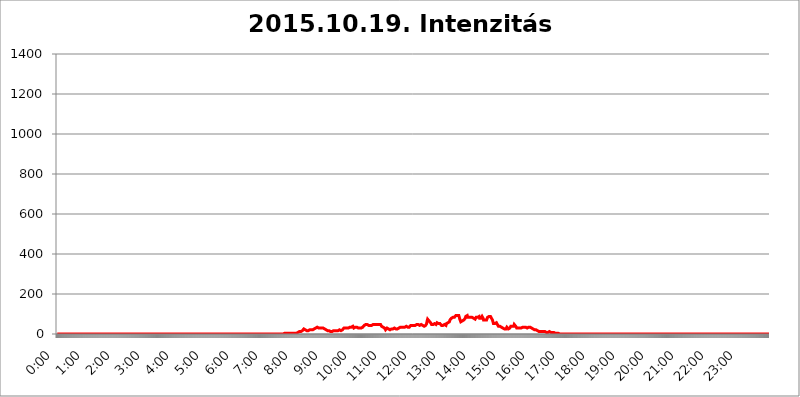
| Category | 2015.10.19. Intenzitás [W/m^2] |
|---|---|
| 0.0 | 0 |
| 0.0006944444444444445 | 0 |
| 0.001388888888888889 | 0 |
| 0.0020833333333333333 | 0 |
| 0.002777777777777778 | 0 |
| 0.003472222222222222 | 0 |
| 0.004166666666666667 | 0 |
| 0.004861111111111111 | 0 |
| 0.005555555555555556 | 0 |
| 0.0062499999999999995 | 0 |
| 0.006944444444444444 | 0 |
| 0.007638888888888889 | 0 |
| 0.008333333333333333 | 0 |
| 0.009027777777777779 | 0 |
| 0.009722222222222222 | 0 |
| 0.010416666666666666 | 0 |
| 0.011111111111111112 | 0 |
| 0.011805555555555555 | 0 |
| 0.012499999999999999 | 0 |
| 0.013194444444444444 | 0 |
| 0.013888888888888888 | 0 |
| 0.014583333333333332 | 0 |
| 0.015277777777777777 | 0 |
| 0.015972222222222224 | 0 |
| 0.016666666666666666 | 0 |
| 0.017361111111111112 | 0 |
| 0.018055555555555557 | 0 |
| 0.01875 | 0 |
| 0.019444444444444445 | 0 |
| 0.02013888888888889 | 0 |
| 0.020833333333333332 | 0 |
| 0.02152777777777778 | 0 |
| 0.022222222222222223 | 0 |
| 0.02291666666666667 | 0 |
| 0.02361111111111111 | 0 |
| 0.024305555555555556 | 0 |
| 0.024999999999999998 | 0 |
| 0.025694444444444447 | 0 |
| 0.02638888888888889 | 0 |
| 0.027083333333333334 | 0 |
| 0.027777777777777776 | 0 |
| 0.02847222222222222 | 0 |
| 0.029166666666666664 | 0 |
| 0.029861111111111113 | 0 |
| 0.030555555555555555 | 0 |
| 0.03125 | 0 |
| 0.03194444444444445 | 0 |
| 0.03263888888888889 | 0 |
| 0.03333333333333333 | 0 |
| 0.034027777777777775 | 0 |
| 0.034722222222222224 | 0 |
| 0.035416666666666666 | 0 |
| 0.036111111111111115 | 0 |
| 0.03680555555555556 | 0 |
| 0.0375 | 0 |
| 0.03819444444444444 | 0 |
| 0.03888888888888889 | 0 |
| 0.03958333333333333 | 0 |
| 0.04027777777777778 | 0 |
| 0.04097222222222222 | 0 |
| 0.041666666666666664 | 0 |
| 0.042361111111111106 | 0 |
| 0.04305555555555556 | 0 |
| 0.043750000000000004 | 0 |
| 0.044444444444444446 | 0 |
| 0.04513888888888889 | 0 |
| 0.04583333333333334 | 0 |
| 0.04652777777777778 | 0 |
| 0.04722222222222222 | 0 |
| 0.04791666666666666 | 0 |
| 0.04861111111111111 | 0 |
| 0.049305555555555554 | 0 |
| 0.049999999999999996 | 0 |
| 0.05069444444444445 | 0 |
| 0.051388888888888894 | 0 |
| 0.052083333333333336 | 0 |
| 0.05277777777777778 | 0 |
| 0.05347222222222222 | 0 |
| 0.05416666666666667 | 0 |
| 0.05486111111111111 | 0 |
| 0.05555555555555555 | 0 |
| 0.05625 | 0 |
| 0.05694444444444444 | 0 |
| 0.057638888888888885 | 0 |
| 0.05833333333333333 | 0 |
| 0.05902777777777778 | 0 |
| 0.059722222222222225 | 0 |
| 0.06041666666666667 | 0 |
| 0.061111111111111116 | 0 |
| 0.06180555555555556 | 0 |
| 0.0625 | 0 |
| 0.06319444444444444 | 0 |
| 0.06388888888888888 | 0 |
| 0.06458333333333334 | 0 |
| 0.06527777777777778 | 0 |
| 0.06597222222222222 | 0 |
| 0.06666666666666667 | 0 |
| 0.06736111111111111 | 0 |
| 0.06805555555555555 | 0 |
| 0.06874999999999999 | 0 |
| 0.06944444444444443 | 0 |
| 0.07013888888888889 | 0 |
| 0.07083333333333333 | 0 |
| 0.07152777777777779 | 0 |
| 0.07222222222222223 | 0 |
| 0.07291666666666667 | 0 |
| 0.07361111111111111 | 0 |
| 0.07430555555555556 | 0 |
| 0.075 | 0 |
| 0.07569444444444444 | 0 |
| 0.0763888888888889 | 0 |
| 0.07708333333333334 | 0 |
| 0.07777777777777778 | 0 |
| 0.07847222222222222 | 0 |
| 0.07916666666666666 | 0 |
| 0.0798611111111111 | 0 |
| 0.08055555555555556 | 0 |
| 0.08125 | 0 |
| 0.08194444444444444 | 0 |
| 0.08263888888888889 | 0 |
| 0.08333333333333333 | 0 |
| 0.08402777777777777 | 0 |
| 0.08472222222222221 | 0 |
| 0.08541666666666665 | 0 |
| 0.08611111111111112 | 0 |
| 0.08680555555555557 | 0 |
| 0.08750000000000001 | 0 |
| 0.08819444444444445 | 0 |
| 0.08888888888888889 | 0 |
| 0.08958333333333333 | 0 |
| 0.09027777777777778 | 0 |
| 0.09097222222222222 | 0 |
| 0.09166666666666667 | 0 |
| 0.09236111111111112 | 0 |
| 0.09305555555555556 | 0 |
| 0.09375 | 0 |
| 0.09444444444444444 | 0 |
| 0.09513888888888888 | 0 |
| 0.09583333333333333 | 0 |
| 0.09652777777777777 | 0 |
| 0.09722222222222222 | 0 |
| 0.09791666666666667 | 0 |
| 0.09861111111111111 | 0 |
| 0.09930555555555555 | 0 |
| 0.09999999999999999 | 0 |
| 0.10069444444444443 | 0 |
| 0.1013888888888889 | 0 |
| 0.10208333333333335 | 0 |
| 0.10277777777777779 | 0 |
| 0.10347222222222223 | 0 |
| 0.10416666666666667 | 0 |
| 0.10486111111111111 | 0 |
| 0.10555555555555556 | 0 |
| 0.10625 | 0 |
| 0.10694444444444444 | 0 |
| 0.1076388888888889 | 0 |
| 0.10833333333333334 | 0 |
| 0.10902777777777778 | 0 |
| 0.10972222222222222 | 0 |
| 0.1111111111111111 | 0 |
| 0.11180555555555556 | 0 |
| 0.11180555555555556 | 0 |
| 0.1125 | 0 |
| 0.11319444444444444 | 0 |
| 0.11388888888888889 | 0 |
| 0.11458333333333333 | 0 |
| 0.11527777777777777 | 0 |
| 0.11597222222222221 | 0 |
| 0.11666666666666665 | 0 |
| 0.1173611111111111 | 0 |
| 0.11805555555555557 | 0 |
| 0.11944444444444445 | 0 |
| 0.12013888888888889 | 0 |
| 0.12083333333333333 | 0 |
| 0.12152777777777778 | 0 |
| 0.12222222222222223 | 0 |
| 0.12291666666666667 | 0 |
| 0.12291666666666667 | 0 |
| 0.12361111111111112 | 0 |
| 0.12430555555555556 | 0 |
| 0.125 | 0 |
| 0.12569444444444444 | 0 |
| 0.12638888888888888 | 0 |
| 0.12708333333333333 | 0 |
| 0.16875 | 0 |
| 0.12847222222222224 | 0 |
| 0.12916666666666668 | 0 |
| 0.12986111111111112 | 0 |
| 0.13055555555555556 | 0 |
| 0.13125 | 0 |
| 0.13194444444444445 | 0 |
| 0.1326388888888889 | 0 |
| 0.13333333333333333 | 0 |
| 0.13402777777777777 | 0 |
| 0.13402777777777777 | 0 |
| 0.13472222222222222 | 0 |
| 0.13541666666666666 | 0 |
| 0.1361111111111111 | 0 |
| 0.13749999999999998 | 0 |
| 0.13819444444444443 | 0 |
| 0.1388888888888889 | 0 |
| 0.13958333333333334 | 0 |
| 0.14027777777777778 | 0 |
| 0.14097222222222222 | 0 |
| 0.14166666666666666 | 0 |
| 0.1423611111111111 | 0 |
| 0.14305555555555557 | 0 |
| 0.14375000000000002 | 0 |
| 0.14444444444444446 | 0 |
| 0.1451388888888889 | 0 |
| 0.1451388888888889 | 0 |
| 0.14652777777777778 | 0 |
| 0.14722222222222223 | 0 |
| 0.14791666666666667 | 0 |
| 0.1486111111111111 | 0 |
| 0.14930555555555555 | 0 |
| 0.15 | 0 |
| 0.15069444444444444 | 0 |
| 0.15138888888888888 | 0 |
| 0.15208333333333332 | 0 |
| 0.15277777777777776 | 0 |
| 0.15347222222222223 | 0 |
| 0.15416666666666667 | 0 |
| 0.15486111111111112 | 0 |
| 0.15555555555555556 | 0 |
| 0.15625 | 0 |
| 0.15694444444444444 | 0 |
| 0.15763888888888888 | 0 |
| 0.15833333333333333 | 0 |
| 0.15902777777777777 | 0 |
| 0.15972222222222224 | 0 |
| 0.16041666666666668 | 0 |
| 0.16111111111111112 | 0 |
| 0.16180555555555556 | 0 |
| 0.1625 | 0 |
| 0.16319444444444445 | 0 |
| 0.1638888888888889 | 0 |
| 0.16458333333333333 | 0 |
| 0.16527777777777777 | 0 |
| 0.16597222222222222 | 0 |
| 0.16666666666666666 | 0 |
| 0.1673611111111111 | 0 |
| 0.16805555555555554 | 0 |
| 0.16874999999999998 | 0 |
| 0.16944444444444443 | 0 |
| 0.17013888888888887 | 0 |
| 0.1708333333333333 | 0 |
| 0.17152777777777775 | 0 |
| 0.17222222222222225 | 0 |
| 0.1729166666666667 | 0 |
| 0.17361111111111113 | 0 |
| 0.17430555555555557 | 0 |
| 0.17500000000000002 | 0 |
| 0.17569444444444446 | 0 |
| 0.1763888888888889 | 0 |
| 0.17708333333333334 | 0 |
| 0.17777777777777778 | 0 |
| 0.17847222222222223 | 0 |
| 0.17916666666666667 | 0 |
| 0.1798611111111111 | 0 |
| 0.18055555555555555 | 0 |
| 0.18125 | 0 |
| 0.18194444444444444 | 0 |
| 0.1826388888888889 | 0 |
| 0.18333333333333335 | 0 |
| 0.1840277777777778 | 0 |
| 0.18472222222222223 | 0 |
| 0.18541666666666667 | 0 |
| 0.18611111111111112 | 0 |
| 0.18680555555555556 | 0 |
| 0.1875 | 0 |
| 0.18819444444444444 | 0 |
| 0.18888888888888888 | 0 |
| 0.18958333333333333 | 0 |
| 0.19027777777777777 | 0 |
| 0.1909722222222222 | 0 |
| 0.19166666666666665 | 0 |
| 0.19236111111111112 | 0 |
| 0.19305555555555554 | 0 |
| 0.19375 | 0 |
| 0.19444444444444445 | 0 |
| 0.1951388888888889 | 0 |
| 0.19583333333333333 | 0 |
| 0.19652777777777777 | 0 |
| 0.19722222222222222 | 0 |
| 0.19791666666666666 | 0 |
| 0.1986111111111111 | 0 |
| 0.19930555555555554 | 0 |
| 0.19999999999999998 | 0 |
| 0.20069444444444443 | 0 |
| 0.20138888888888887 | 0 |
| 0.2020833333333333 | 0 |
| 0.2027777777777778 | 0 |
| 0.2034722222222222 | 0 |
| 0.2041666666666667 | 0 |
| 0.20486111111111113 | 0 |
| 0.20555555555555557 | 0 |
| 0.20625000000000002 | 0 |
| 0.20694444444444446 | 0 |
| 0.2076388888888889 | 0 |
| 0.20833333333333334 | 0 |
| 0.20902777777777778 | 0 |
| 0.20972222222222223 | 0 |
| 0.21041666666666667 | 0 |
| 0.2111111111111111 | 0 |
| 0.21180555555555555 | 0 |
| 0.2125 | 0 |
| 0.21319444444444444 | 0 |
| 0.2138888888888889 | 0 |
| 0.21458333333333335 | 0 |
| 0.2152777777777778 | 0 |
| 0.21597222222222223 | 0 |
| 0.21666666666666667 | 0 |
| 0.21736111111111112 | 0 |
| 0.21805555555555556 | 0 |
| 0.21875 | 0 |
| 0.21944444444444444 | 0 |
| 0.22013888888888888 | 0 |
| 0.22083333333333333 | 0 |
| 0.22152777777777777 | 0 |
| 0.2222222222222222 | 0 |
| 0.22291666666666665 | 0 |
| 0.2236111111111111 | 0 |
| 0.22430555555555556 | 0 |
| 0.225 | 0 |
| 0.22569444444444445 | 0 |
| 0.2263888888888889 | 0 |
| 0.22708333333333333 | 0 |
| 0.22777777777777777 | 0 |
| 0.22847222222222222 | 0 |
| 0.22916666666666666 | 0 |
| 0.2298611111111111 | 0 |
| 0.23055555555555554 | 0 |
| 0.23124999999999998 | 0 |
| 0.23194444444444443 | 0 |
| 0.23263888888888887 | 0 |
| 0.2333333333333333 | 0 |
| 0.2340277777777778 | 0 |
| 0.2347222222222222 | 0 |
| 0.2354166666666667 | 0 |
| 0.23611111111111113 | 0 |
| 0.23680555555555557 | 0 |
| 0.23750000000000002 | 0 |
| 0.23819444444444446 | 0 |
| 0.2388888888888889 | 0 |
| 0.23958333333333334 | 0 |
| 0.24027777777777778 | 0 |
| 0.24097222222222223 | 0 |
| 0.24166666666666667 | 0 |
| 0.2423611111111111 | 0 |
| 0.24305555555555555 | 0 |
| 0.24375 | 0 |
| 0.24444444444444446 | 0 |
| 0.24513888888888888 | 0 |
| 0.24583333333333335 | 0 |
| 0.2465277777777778 | 0 |
| 0.24722222222222223 | 0 |
| 0.24791666666666667 | 0 |
| 0.24861111111111112 | 0 |
| 0.24930555555555556 | 0 |
| 0.25 | 0 |
| 0.25069444444444444 | 0 |
| 0.2513888888888889 | 0 |
| 0.2520833333333333 | 0 |
| 0.25277777777777777 | 0 |
| 0.2534722222222222 | 0 |
| 0.25416666666666665 | 0 |
| 0.2548611111111111 | 0 |
| 0.2555555555555556 | 0 |
| 0.25625000000000003 | 0 |
| 0.2569444444444445 | 0 |
| 0.2576388888888889 | 0 |
| 0.25833333333333336 | 0 |
| 0.2590277777777778 | 0 |
| 0.25972222222222224 | 0 |
| 0.2604166666666667 | 0 |
| 0.2611111111111111 | 0 |
| 0.26180555555555557 | 0 |
| 0.2625 | 0 |
| 0.26319444444444445 | 0 |
| 0.2638888888888889 | 0 |
| 0.26458333333333334 | 0 |
| 0.2652777777777778 | 0 |
| 0.2659722222222222 | 0 |
| 0.26666666666666666 | 0 |
| 0.2673611111111111 | 0 |
| 0.26805555555555555 | 0 |
| 0.26875 | 0 |
| 0.26944444444444443 | 0 |
| 0.2701388888888889 | 0 |
| 0.2708333333333333 | 0 |
| 0.27152777777777776 | 0 |
| 0.2722222222222222 | 0 |
| 0.27291666666666664 | 0 |
| 0.2736111111111111 | 0 |
| 0.2743055555555555 | 0 |
| 0.27499999999999997 | 0 |
| 0.27569444444444446 | 0 |
| 0.27638888888888885 | 0 |
| 0.27708333333333335 | 0 |
| 0.2777777777777778 | 0 |
| 0.27847222222222223 | 0 |
| 0.2791666666666667 | 0 |
| 0.2798611111111111 | 0 |
| 0.28055555555555556 | 0 |
| 0.28125 | 0 |
| 0.28194444444444444 | 0 |
| 0.2826388888888889 | 0 |
| 0.2833333333333333 | 0 |
| 0.28402777777777777 | 0 |
| 0.2847222222222222 | 0 |
| 0.28541666666666665 | 0 |
| 0.28611111111111115 | 0 |
| 0.28680555555555554 | 0 |
| 0.28750000000000003 | 0 |
| 0.2881944444444445 | 0 |
| 0.2888888888888889 | 0 |
| 0.28958333333333336 | 0 |
| 0.2902777777777778 | 0 |
| 0.29097222222222224 | 0 |
| 0.2916666666666667 | 0 |
| 0.2923611111111111 | 0 |
| 0.29305555555555557 | 0 |
| 0.29375 | 0 |
| 0.29444444444444445 | 0 |
| 0.2951388888888889 | 0 |
| 0.29583333333333334 | 0 |
| 0.2965277777777778 | 0 |
| 0.2972222222222222 | 0 |
| 0.29791666666666666 | 0 |
| 0.2986111111111111 | 0 |
| 0.29930555555555555 | 0 |
| 0.3 | 0 |
| 0.30069444444444443 | 0 |
| 0.3013888888888889 | 0 |
| 0.3020833333333333 | 0 |
| 0.30277777777777776 | 0 |
| 0.3034722222222222 | 0 |
| 0.30416666666666664 | 0 |
| 0.3048611111111111 | 0 |
| 0.3055555555555555 | 0 |
| 0.30624999999999997 | 0 |
| 0.3069444444444444 | 0 |
| 0.3076388888888889 | 0 |
| 0.30833333333333335 | 0 |
| 0.3090277777777778 | 0 |
| 0.30972222222222223 | 0 |
| 0.3104166666666667 | 0 |
| 0.3111111111111111 | 0 |
| 0.31180555555555556 | 0 |
| 0.3125 | 0 |
| 0.31319444444444444 | 0 |
| 0.3138888888888889 | 0 |
| 0.3145833333333333 | 0 |
| 0.31527777777777777 | 0 |
| 0.3159722222222222 | 0 |
| 0.31666666666666665 | 0 |
| 0.31736111111111115 | 0 |
| 0.31805555555555554 | 3.525 |
| 0.31875000000000003 | 3.525 |
| 0.3194444444444445 | 3.525 |
| 0.3201388888888889 | 3.525 |
| 0.32083333333333336 | 3.525 |
| 0.3215277777777778 | 3.525 |
| 0.32222222222222224 | 3.525 |
| 0.3229166666666667 | 3.525 |
| 0.3236111111111111 | 3.525 |
| 0.32430555555555557 | 3.525 |
| 0.325 | 3.525 |
| 0.32569444444444445 | 3.525 |
| 0.3263888888888889 | 3.525 |
| 0.32708333333333334 | 3.525 |
| 0.3277777777777778 | 3.525 |
| 0.3284722222222222 | 3.525 |
| 0.32916666666666666 | 3.525 |
| 0.3298611111111111 | 3.525 |
| 0.33055555555555555 | 3.525 |
| 0.33125 | 3.525 |
| 0.33194444444444443 | 3.525 |
| 0.3326388888888889 | 3.525 |
| 0.3333333333333333 | 3.525 |
| 0.3340277777777778 | 3.525 |
| 0.3347222222222222 | 3.525 |
| 0.3354166666666667 | 3.525 |
| 0.3361111111111111 | 7.887 |
| 0.3368055555555556 | 7.887 |
| 0.33749999999999997 | 7.887 |
| 0.33819444444444446 | 7.887 |
| 0.33888888888888885 | 12.257 |
| 0.33958333333333335 | 12.257 |
| 0.34027777777777773 | 12.257 |
| 0.34097222222222223 | 7.887 |
| 0.3416666666666666 | 12.257 |
| 0.3423611111111111 | 12.257 |
| 0.3430555555555555 | 12.257 |
| 0.34375 | 16.636 |
| 0.3444444444444445 | 21.024 |
| 0.3451388888888889 | 21.024 |
| 0.3458333333333334 | 25.419 |
| 0.34652777777777777 | 25.419 |
| 0.34722222222222227 | 21.024 |
| 0.34791666666666665 | 21.024 |
| 0.34861111111111115 | 16.636 |
| 0.34930555555555554 | 16.636 |
| 0.35000000000000003 | 16.636 |
| 0.3506944444444444 | 16.636 |
| 0.3513888888888889 | 16.636 |
| 0.3520833333333333 | 16.636 |
| 0.3527777777777778 | 21.024 |
| 0.3534722222222222 | 21.024 |
| 0.3541666666666667 | 21.024 |
| 0.3548611111111111 | 25.419 |
| 0.35555555555555557 | 25.419 |
| 0.35625 | 21.024 |
| 0.35694444444444445 | 21.024 |
| 0.3576388888888889 | 21.024 |
| 0.35833333333333334 | 21.024 |
| 0.3590277777777778 | 25.419 |
| 0.3597222222222222 | 25.419 |
| 0.36041666666666666 | 25.419 |
| 0.3611111111111111 | 25.419 |
| 0.36180555555555555 | 29.823 |
| 0.3625 | 29.823 |
| 0.36319444444444443 | 29.823 |
| 0.3638888888888889 | 34.234 |
| 0.3645833333333333 | 34.234 |
| 0.3652777777777778 | 34.234 |
| 0.3659722222222222 | 29.823 |
| 0.3666666666666667 | 29.823 |
| 0.3673611111111111 | 29.823 |
| 0.3680555555555556 | 29.823 |
| 0.36874999999999997 | 29.823 |
| 0.36944444444444446 | 29.823 |
| 0.37013888888888885 | 29.823 |
| 0.37083333333333335 | 29.823 |
| 0.37152777777777773 | 34.234 |
| 0.37222222222222223 | 29.823 |
| 0.3729166666666666 | 29.823 |
| 0.3736111111111111 | 29.823 |
| 0.3743055555555555 | 29.823 |
| 0.375 | 25.419 |
| 0.3756944444444445 | 25.419 |
| 0.3763888888888889 | 25.419 |
| 0.3770833333333334 | 21.024 |
| 0.37777777777777777 | 21.024 |
| 0.37847222222222227 | 16.636 |
| 0.37916666666666665 | 16.636 |
| 0.37986111111111115 | 16.636 |
| 0.38055555555555554 | 16.636 |
| 0.38125000000000003 | 16.636 |
| 0.3819444444444444 | 16.636 |
| 0.3826388888888889 | 12.257 |
| 0.3833333333333333 | 12.257 |
| 0.3840277777777778 | 12.257 |
| 0.3847222222222222 | 12.257 |
| 0.3854166666666667 | 12.257 |
| 0.3861111111111111 | 12.257 |
| 0.38680555555555557 | 12.257 |
| 0.3875 | 16.636 |
| 0.38819444444444445 | 12.257 |
| 0.3888888888888889 | 16.636 |
| 0.38958333333333334 | 16.636 |
| 0.3902777777777778 | 16.636 |
| 0.3909722222222222 | 16.636 |
| 0.39166666666666666 | 16.636 |
| 0.3923611111111111 | 16.636 |
| 0.39305555555555555 | 16.636 |
| 0.39375 | 16.636 |
| 0.39444444444444443 | 16.636 |
| 0.3951388888888889 | 16.636 |
| 0.3958333333333333 | 21.024 |
| 0.3965277777777778 | 21.024 |
| 0.3972222222222222 | 16.636 |
| 0.3979166666666667 | 16.636 |
| 0.3986111111111111 | 21.024 |
| 0.3993055555555556 | 21.024 |
| 0.39999999999999997 | 21.024 |
| 0.40069444444444446 | 25.419 |
| 0.40138888888888885 | 25.419 |
| 0.40208333333333335 | 29.823 |
| 0.40277777777777773 | 29.823 |
| 0.40347222222222223 | 29.823 |
| 0.4041666666666666 | 29.823 |
| 0.4048611111111111 | 25.419 |
| 0.4055555555555555 | 25.419 |
| 0.40625 | 29.823 |
| 0.4069444444444445 | 29.823 |
| 0.4076388888888889 | 29.823 |
| 0.4083333333333334 | 29.823 |
| 0.40902777777777777 | 29.823 |
| 0.40972222222222227 | 34.234 |
| 0.41041666666666665 | 34.234 |
| 0.41111111111111115 | 38.653 |
| 0.41180555555555554 | 34.234 |
| 0.41250000000000003 | 34.234 |
| 0.4131944444444444 | 38.653 |
| 0.4138888888888889 | 38.653 |
| 0.4145833333333333 | 38.653 |
| 0.4152777777777778 | 34.234 |
| 0.4159722222222222 | 29.823 |
| 0.4166666666666667 | 29.823 |
| 0.4173611111111111 | 34.234 |
| 0.41805555555555557 | 34.234 |
| 0.41875 | 38.653 |
| 0.41944444444444445 | 38.653 |
| 0.4201388888888889 | 34.234 |
| 0.42083333333333334 | 34.234 |
| 0.4215277777777778 | 29.823 |
| 0.4222222222222222 | 29.823 |
| 0.42291666666666666 | 29.823 |
| 0.4236111111111111 | 29.823 |
| 0.42430555555555555 | 29.823 |
| 0.425 | 29.823 |
| 0.42569444444444443 | 29.823 |
| 0.4263888888888889 | 29.823 |
| 0.4270833333333333 | 29.823 |
| 0.4277777777777778 | 29.823 |
| 0.4284722222222222 | 34.234 |
| 0.4291666666666667 | 34.234 |
| 0.4298611111111111 | 38.653 |
| 0.4305555555555556 | 43.079 |
| 0.43124999999999997 | 43.079 |
| 0.43194444444444446 | 47.511 |
| 0.43263888888888885 | 47.511 |
| 0.43333333333333335 | 47.511 |
| 0.43402777777777773 | 47.511 |
| 0.43472222222222223 | 47.511 |
| 0.4354166666666666 | 47.511 |
| 0.4361111111111111 | 43.079 |
| 0.4368055555555555 | 43.079 |
| 0.4375 | 43.079 |
| 0.4381944444444445 | 43.079 |
| 0.4388888888888889 | 43.079 |
| 0.4395833333333334 | 43.079 |
| 0.44027777777777777 | 43.079 |
| 0.44097222222222227 | 43.079 |
| 0.44166666666666665 | 43.079 |
| 0.44236111111111115 | 47.511 |
| 0.44305555555555554 | 47.511 |
| 0.44375000000000003 | 47.511 |
| 0.4444444444444444 | 47.511 |
| 0.4451388888888889 | 47.511 |
| 0.4458333333333333 | 51.951 |
| 0.4465277777777778 | 47.511 |
| 0.4472222222222222 | 47.511 |
| 0.4479166666666667 | 43.079 |
| 0.4486111111111111 | 47.511 |
| 0.44930555555555557 | 47.511 |
| 0.45 | 51.951 |
| 0.45069444444444445 | 51.951 |
| 0.4513888888888889 | 47.511 |
| 0.45208333333333334 | 47.511 |
| 0.4527777777777778 | 47.511 |
| 0.4534722222222222 | 47.511 |
| 0.45416666666666666 | 43.079 |
| 0.4548611111111111 | 38.653 |
| 0.45555555555555555 | 34.234 |
| 0.45625 | 34.234 |
| 0.45694444444444443 | 34.234 |
| 0.4576388888888889 | 34.234 |
| 0.4583333333333333 | 29.823 |
| 0.4590277777777778 | 29.823 |
| 0.4597222222222222 | 25.419 |
| 0.4604166666666667 | 21.024 |
| 0.4611111111111111 | 21.024 |
| 0.4618055555555556 | 25.419 |
| 0.46249999999999997 | 29.823 |
| 0.46319444444444446 | 29.823 |
| 0.46388888888888885 | 25.419 |
| 0.46458333333333335 | 25.419 |
| 0.46527777777777773 | 25.419 |
| 0.46597222222222223 | 21.024 |
| 0.4666666666666666 | 21.024 |
| 0.4673611111111111 | 25.419 |
| 0.4680555555555555 | 25.419 |
| 0.46875 | 25.419 |
| 0.4694444444444445 | 21.024 |
| 0.4701388888888889 | 25.419 |
| 0.4708333333333334 | 25.419 |
| 0.47152777777777777 | 25.419 |
| 0.47222222222222227 | 25.419 |
| 0.47291666666666665 | 29.823 |
| 0.47361111111111115 | 25.419 |
| 0.47430555555555554 | 29.823 |
| 0.47500000000000003 | 25.419 |
| 0.4756944444444444 | 25.419 |
| 0.4763888888888889 | 25.419 |
| 0.4770833333333333 | 25.419 |
| 0.4777777777777778 | 29.823 |
| 0.4784722222222222 | 29.823 |
| 0.4791666666666667 | 29.823 |
| 0.4798611111111111 | 29.823 |
| 0.48055555555555557 | 29.823 |
| 0.48125 | 34.234 |
| 0.48194444444444445 | 34.234 |
| 0.4826388888888889 | 34.234 |
| 0.48333333333333334 | 34.234 |
| 0.4840277777777778 | 34.234 |
| 0.4847222222222222 | 38.653 |
| 0.48541666666666666 | 34.234 |
| 0.4861111111111111 | 34.234 |
| 0.48680555555555555 | 34.234 |
| 0.4875 | 34.234 |
| 0.48819444444444443 | 38.653 |
| 0.4888888888888889 | 38.653 |
| 0.4895833333333333 | 38.653 |
| 0.4902777777777778 | 38.653 |
| 0.4909722222222222 | 34.234 |
| 0.4916666666666667 | 34.234 |
| 0.4923611111111111 | 34.234 |
| 0.4930555555555556 | 34.234 |
| 0.49374999999999997 | 34.234 |
| 0.49444444444444446 | 38.653 |
| 0.49513888888888885 | 38.653 |
| 0.49583333333333335 | 43.079 |
| 0.49652777777777773 | 43.079 |
| 0.49722222222222223 | 43.079 |
| 0.4979166666666666 | 43.079 |
| 0.4986111111111111 | 43.079 |
| 0.4993055555555555 | 43.079 |
| 0.5 | 43.079 |
| 0.5006944444444444 | 43.079 |
| 0.5013888888888889 | 47.511 |
| 0.5020833333333333 | 43.079 |
| 0.5027777777777778 | 43.079 |
| 0.5034722222222222 | 43.079 |
| 0.5041666666666667 | 47.511 |
| 0.5048611111111111 | 47.511 |
| 0.5055555555555555 | 47.511 |
| 0.50625 | 47.511 |
| 0.5069444444444444 | 43.079 |
| 0.5076388888888889 | 47.511 |
| 0.5083333333333333 | 43.079 |
| 0.5090277777777777 | 43.079 |
| 0.5097222222222222 | 43.079 |
| 0.5104166666666666 | 47.511 |
| 0.5111111111111112 | 47.511 |
| 0.5118055555555555 | 47.511 |
| 0.5125000000000001 | 43.079 |
| 0.5131944444444444 | 38.653 |
| 0.513888888888889 | 38.653 |
| 0.5145833333333333 | 38.653 |
| 0.5152777777777778 | 43.079 |
| 0.5159722222222222 | 43.079 |
| 0.5166666666666667 | 43.079 |
| 0.517361111111111 | 43.079 |
| 0.5180555555555556 | 51.951 |
| 0.5187499999999999 | 65.31 |
| 0.5194444444444445 | 74.246 |
| 0.5201388888888888 | 69.775 |
| 0.5208333333333334 | 69.775 |
| 0.5215277777777778 | 65.31 |
| 0.5222222222222223 | 65.31 |
| 0.5229166666666667 | 65.31 |
| 0.5236111111111111 | 56.398 |
| 0.5243055555555556 | 51.951 |
| 0.525 | 47.511 |
| 0.5256944444444445 | 47.511 |
| 0.5263888888888889 | 43.079 |
| 0.5270833333333333 | 47.511 |
| 0.5277777777777778 | 47.511 |
| 0.5284722222222222 | 47.511 |
| 0.5291666666666667 | 51.951 |
| 0.5298611111111111 | 51.951 |
| 0.5305555555555556 | 51.951 |
| 0.53125 | 47.511 |
| 0.5319444444444444 | 51.951 |
| 0.5326388888888889 | 56.398 |
| 0.5333333333333333 | 51.951 |
| 0.5340277777777778 | 51.951 |
| 0.5347222222222222 | 51.951 |
| 0.5354166666666667 | 51.951 |
| 0.5361111111111111 | 51.951 |
| 0.5368055555555555 | 51.951 |
| 0.5375 | 47.511 |
| 0.5381944444444444 | 47.511 |
| 0.5388888888888889 | 43.079 |
| 0.5395833333333333 | 43.079 |
| 0.5402777777777777 | 38.653 |
| 0.5409722222222222 | 43.079 |
| 0.5416666666666666 | 47.511 |
| 0.5423611111111112 | 47.511 |
| 0.5430555555555555 | 47.511 |
| 0.5437500000000001 | 47.511 |
| 0.5444444444444444 | 43.079 |
| 0.545138888888889 | 43.079 |
| 0.5458333333333333 | 51.951 |
| 0.5465277777777778 | 51.951 |
| 0.5472222222222222 | 56.398 |
| 0.5479166666666667 | 56.398 |
| 0.548611111111111 | 56.398 |
| 0.5493055555555556 | 56.398 |
| 0.5499999999999999 | 60.85 |
| 0.5506944444444445 | 69.775 |
| 0.5513888888888888 | 69.775 |
| 0.5520833333333334 | 74.246 |
| 0.5527777777777778 | 78.722 |
| 0.5534722222222223 | 78.722 |
| 0.5541666666666667 | 83.205 |
| 0.5548611111111111 | 83.205 |
| 0.5555555555555556 | 83.205 |
| 0.55625 | 83.205 |
| 0.5569444444444445 | 83.205 |
| 0.5576388888888889 | 83.205 |
| 0.5583333333333333 | 87.692 |
| 0.5590277777777778 | 92.184 |
| 0.5597222222222222 | 96.682 |
| 0.5604166666666667 | 92.184 |
| 0.5611111111111111 | 92.184 |
| 0.5618055555555556 | 92.184 |
| 0.5625 | 92.184 |
| 0.5631944444444444 | 92.184 |
| 0.5638888888888889 | 87.692 |
| 0.5645833333333333 | 74.246 |
| 0.5652777777777778 | 69.775 |
| 0.5659722222222222 | 60.85 |
| 0.5666666666666667 | 60.85 |
| 0.5673611111111111 | 65.31 |
| 0.5680555555555555 | 65.31 |
| 0.56875 | 65.31 |
| 0.5694444444444444 | 69.775 |
| 0.5701388888888889 | 69.775 |
| 0.5708333333333333 | 69.775 |
| 0.5715277777777777 | 69.775 |
| 0.5722222222222222 | 78.722 |
| 0.5729166666666666 | 87.692 |
| 0.5736111111111112 | 87.692 |
| 0.5743055555555555 | 92.184 |
| 0.5750000000000001 | 92.184 |
| 0.5756944444444444 | 83.205 |
| 0.576388888888889 | 78.722 |
| 0.5770833333333333 | 83.205 |
| 0.5777777777777778 | 83.205 |
| 0.5784722222222222 | 83.205 |
| 0.5791666666666667 | 87.692 |
| 0.579861111111111 | 83.205 |
| 0.5805555555555556 | 83.205 |
| 0.5812499999999999 | 83.205 |
| 0.5819444444444445 | 83.205 |
| 0.5826388888888888 | 83.205 |
| 0.5833333333333334 | 83.205 |
| 0.5840277777777778 | 78.722 |
| 0.5847222222222223 | 74.246 |
| 0.5854166666666667 | 74.246 |
| 0.5861111111111111 | 74.246 |
| 0.5868055555555556 | 74.246 |
| 0.5875 | 83.205 |
| 0.5881944444444445 | 78.722 |
| 0.5888888888888889 | 78.722 |
| 0.5895833333333333 | 83.205 |
| 0.5902777777777778 | 87.692 |
| 0.5909722222222222 | 87.692 |
| 0.5916666666666667 | 87.692 |
| 0.5923611111111111 | 78.722 |
| 0.5930555555555556 | 74.246 |
| 0.59375 | 74.246 |
| 0.5944444444444444 | 78.722 |
| 0.5951388888888889 | 83.205 |
| 0.5958333333333333 | 87.692 |
| 0.5965277777777778 | 87.692 |
| 0.5972222222222222 | 78.722 |
| 0.5979166666666667 | 69.775 |
| 0.5986111111111111 | 65.31 |
| 0.5993055555555555 | 65.31 |
| 0.6 | 69.775 |
| 0.6006944444444444 | 69.775 |
| 0.6013888888888889 | 69.775 |
| 0.6020833333333333 | 69.775 |
| 0.6027777777777777 | 74.246 |
| 0.6034722222222222 | 83.205 |
| 0.6041666666666666 | 83.205 |
| 0.6048611111111112 | 83.205 |
| 0.6055555555555555 | 87.692 |
| 0.6062500000000001 | 92.184 |
| 0.6069444444444444 | 87.692 |
| 0.607638888888889 | 87.692 |
| 0.6083333333333333 | 83.205 |
| 0.6090277777777778 | 78.722 |
| 0.6097222222222222 | 74.246 |
| 0.6104166666666667 | 69.775 |
| 0.611111111111111 | 60.85 |
| 0.6118055555555556 | 51.951 |
| 0.6124999999999999 | 47.511 |
| 0.6131944444444445 | 47.511 |
| 0.6138888888888888 | 51.951 |
| 0.6145833333333334 | 51.951 |
| 0.6152777777777778 | 51.951 |
| 0.6159722222222223 | 56.398 |
| 0.6166666666666667 | 51.951 |
| 0.6173611111111111 | 47.511 |
| 0.6180555555555556 | 47.511 |
| 0.61875 | 38.653 |
| 0.6194444444444445 | 34.234 |
| 0.6201388888888889 | 34.234 |
| 0.6208333333333333 | 38.653 |
| 0.6215277777777778 | 43.079 |
| 0.6222222222222222 | 38.653 |
| 0.6229166666666667 | 34.234 |
| 0.6236111111111111 | 34.234 |
| 0.6243055555555556 | 29.823 |
| 0.625 | 29.823 |
| 0.6256944444444444 | 34.234 |
| 0.6263888888888889 | 29.823 |
| 0.6270833333333333 | 25.419 |
| 0.6277777777777778 | 21.024 |
| 0.6284722222222222 | 21.024 |
| 0.6291666666666667 | 25.419 |
| 0.6298611111111111 | 29.823 |
| 0.6305555555555555 | 34.234 |
| 0.63125 | 34.234 |
| 0.6319444444444444 | 29.823 |
| 0.6326388888888889 | 25.419 |
| 0.6333333333333333 | 25.419 |
| 0.6340277777777777 | 25.419 |
| 0.6347222222222222 | 29.823 |
| 0.6354166666666666 | 29.823 |
| 0.6361111111111112 | 38.653 |
| 0.6368055555555555 | 38.653 |
| 0.6375000000000001 | 38.653 |
| 0.6381944444444444 | 38.653 |
| 0.638888888888889 | 38.653 |
| 0.6395833333333333 | 38.653 |
| 0.6402777777777778 | 38.653 |
| 0.6409722222222222 | 47.511 |
| 0.6416666666666667 | 47.511 |
| 0.642361111111111 | 47.511 |
| 0.6430555555555556 | 38.653 |
| 0.6437499999999999 | 34.234 |
| 0.6444444444444445 | 29.823 |
| 0.6451388888888888 | 29.823 |
| 0.6458333333333334 | 29.823 |
| 0.6465277777777778 | 29.823 |
| 0.6472222222222223 | 29.823 |
| 0.6479166666666667 | 29.823 |
| 0.6486111111111111 | 29.823 |
| 0.6493055555555556 | 29.823 |
| 0.65 | 29.823 |
| 0.6506944444444445 | 29.823 |
| 0.6513888888888889 | 29.823 |
| 0.6520833333333333 | 34.234 |
| 0.6527777777777778 | 34.234 |
| 0.6534722222222222 | 34.234 |
| 0.6541666666666667 | 34.234 |
| 0.6548611111111111 | 34.234 |
| 0.6555555555555556 | 34.234 |
| 0.65625 | 34.234 |
| 0.6569444444444444 | 34.234 |
| 0.6576388888888889 | 34.234 |
| 0.6583333333333333 | 34.234 |
| 0.6590277777777778 | 29.823 |
| 0.6597222222222222 | 29.823 |
| 0.6604166666666667 | 29.823 |
| 0.6611111111111111 | 34.234 |
| 0.6618055555555555 | 34.234 |
| 0.6625 | 34.234 |
| 0.6631944444444444 | 34.234 |
| 0.6638888888888889 | 34.234 |
| 0.6645833333333333 | 29.823 |
| 0.6652777777777777 | 29.823 |
| 0.6659722222222222 | 25.419 |
| 0.6666666666666666 | 25.419 |
| 0.6673611111111111 | 25.419 |
| 0.6680555555555556 | 21.024 |
| 0.6687500000000001 | 21.024 |
| 0.6694444444444444 | 21.024 |
| 0.6701388888888888 | 21.024 |
| 0.6708333333333334 | 21.024 |
| 0.6715277777777778 | 21.024 |
| 0.6722222222222222 | 21.024 |
| 0.6729166666666666 | 16.636 |
| 0.6736111111111112 | 16.636 |
| 0.6743055555555556 | 16.636 |
| 0.6749999999999999 | 16.636 |
| 0.6756944444444444 | 12.257 |
| 0.6763888888888889 | 12.257 |
| 0.6770833333333334 | 12.257 |
| 0.6777777777777777 | 12.257 |
| 0.6784722222222223 | 12.257 |
| 0.6791666666666667 | 12.257 |
| 0.6798611111111111 | 12.257 |
| 0.6805555555555555 | 12.257 |
| 0.68125 | 12.257 |
| 0.6819444444444445 | 12.257 |
| 0.6826388888888889 | 12.257 |
| 0.6833333333333332 | 12.257 |
| 0.6840277777777778 | 12.257 |
| 0.6847222222222222 | 12.257 |
| 0.6854166666666667 | 7.887 |
| 0.686111111111111 | 7.887 |
| 0.6868055555555556 | 7.887 |
| 0.6875 | 7.887 |
| 0.6881944444444444 | 7.887 |
| 0.688888888888889 | 12.257 |
| 0.6895833333333333 | 12.257 |
| 0.6902777777777778 | 12.257 |
| 0.6909722222222222 | 7.887 |
| 0.6916666666666668 | 12.257 |
| 0.6923611111111111 | 7.887 |
| 0.6930555555555555 | 7.887 |
| 0.69375 | 7.887 |
| 0.6944444444444445 | 7.887 |
| 0.6951388888888889 | 7.887 |
| 0.6958333333333333 | 7.887 |
| 0.6965277777777777 | 7.887 |
| 0.6972222222222223 | 3.525 |
| 0.6979166666666666 | 3.525 |
| 0.6986111111111111 | 3.525 |
| 0.6993055555555556 | 3.525 |
| 0.7000000000000001 | 3.525 |
| 0.7006944444444444 | 3.525 |
| 0.7013888888888888 | 3.525 |
| 0.7020833333333334 | 3.525 |
| 0.7027777777777778 | 3.525 |
| 0.7034722222222222 | 3.525 |
| 0.7041666666666666 | 3.525 |
| 0.7048611111111112 | 0 |
| 0.7055555555555556 | 3.525 |
| 0.7062499999999999 | 3.525 |
| 0.7069444444444444 | 0 |
| 0.7076388888888889 | 0 |
| 0.7083333333333334 | 0 |
| 0.7090277777777777 | 0 |
| 0.7097222222222223 | 0 |
| 0.7104166666666667 | 0 |
| 0.7111111111111111 | 0 |
| 0.7118055555555555 | 3.525 |
| 0.7125 | 0 |
| 0.7131944444444445 | 0 |
| 0.7138888888888889 | 0 |
| 0.7145833333333332 | 0 |
| 0.7152777777777778 | 0 |
| 0.7159722222222222 | 0 |
| 0.7166666666666667 | 0 |
| 0.717361111111111 | 0 |
| 0.7180555555555556 | 0 |
| 0.71875 | 0 |
| 0.7194444444444444 | 0 |
| 0.720138888888889 | 0 |
| 0.7208333333333333 | 0 |
| 0.7215277777777778 | 0 |
| 0.7222222222222222 | 0 |
| 0.7229166666666668 | 0 |
| 0.7236111111111111 | 0 |
| 0.7243055555555555 | 0 |
| 0.725 | 0 |
| 0.7256944444444445 | 0 |
| 0.7263888888888889 | 0 |
| 0.7270833333333333 | 0 |
| 0.7277777777777777 | 0 |
| 0.7284722222222223 | 0 |
| 0.7291666666666666 | 0 |
| 0.7298611111111111 | 0 |
| 0.7305555555555556 | 0 |
| 0.7312500000000001 | 0 |
| 0.7319444444444444 | 0 |
| 0.7326388888888888 | 0 |
| 0.7333333333333334 | 0 |
| 0.7340277777777778 | 0 |
| 0.7347222222222222 | 0 |
| 0.7354166666666666 | 0 |
| 0.7361111111111112 | 0 |
| 0.7368055555555556 | 0 |
| 0.7374999999999999 | 0 |
| 0.7381944444444444 | 0 |
| 0.7388888888888889 | 0 |
| 0.7395833333333334 | 0 |
| 0.7402777777777777 | 0 |
| 0.7409722222222223 | 0 |
| 0.7416666666666667 | 0 |
| 0.7423611111111111 | 0 |
| 0.7430555555555555 | 0 |
| 0.74375 | 0 |
| 0.7444444444444445 | 0 |
| 0.7451388888888889 | 0 |
| 0.7458333333333332 | 0 |
| 0.7465277777777778 | 0 |
| 0.7472222222222222 | 0 |
| 0.7479166666666667 | 0 |
| 0.748611111111111 | 0 |
| 0.7493055555555556 | 0 |
| 0.75 | 0 |
| 0.7506944444444444 | 0 |
| 0.751388888888889 | 0 |
| 0.7520833333333333 | 0 |
| 0.7527777777777778 | 0 |
| 0.7534722222222222 | 0 |
| 0.7541666666666668 | 0 |
| 0.7548611111111111 | 0 |
| 0.7555555555555555 | 0 |
| 0.75625 | 0 |
| 0.7569444444444445 | 0 |
| 0.7576388888888889 | 0 |
| 0.7583333333333333 | 0 |
| 0.7590277777777777 | 0 |
| 0.7597222222222223 | 0 |
| 0.7604166666666666 | 0 |
| 0.7611111111111111 | 0 |
| 0.7618055555555556 | 0 |
| 0.7625000000000001 | 0 |
| 0.7631944444444444 | 0 |
| 0.7638888888888888 | 0 |
| 0.7645833333333334 | 0 |
| 0.7652777777777778 | 0 |
| 0.7659722222222222 | 0 |
| 0.7666666666666666 | 0 |
| 0.7673611111111112 | 0 |
| 0.7680555555555556 | 0 |
| 0.7687499999999999 | 0 |
| 0.7694444444444444 | 0 |
| 0.7701388888888889 | 0 |
| 0.7708333333333334 | 0 |
| 0.7715277777777777 | 0 |
| 0.7722222222222223 | 0 |
| 0.7729166666666667 | 0 |
| 0.7736111111111111 | 0 |
| 0.7743055555555555 | 0 |
| 0.775 | 0 |
| 0.7756944444444445 | 0 |
| 0.7763888888888889 | 0 |
| 0.7770833333333332 | 0 |
| 0.7777777777777778 | 0 |
| 0.7784722222222222 | 0 |
| 0.7791666666666667 | 0 |
| 0.779861111111111 | 0 |
| 0.7805555555555556 | 0 |
| 0.78125 | 0 |
| 0.7819444444444444 | 0 |
| 0.782638888888889 | 0 |
| 0.7833333333333333 | 0 |
| 0.7840277777777778 | 0 |
| 0.7847222222222222 | 0 |
| 0.7854166666666668 | 0 |
| 0.7861111111111111 | 0 |
| 0.7868055555555555 | 0 |
| 0.7875 | 0 |
| 0.7881944444444445 | 0 |
| 0.7888888888888889 | 0 |
| 0.7895833333333333 | 0 |
| 0.7902777777777777 | 0 |
| 0.7909722222222223 | 0 |
| 0.7916666666666666 | 0 |
| 0.7923611111111111 | 0 |
| 0.7930555555555556 | 0 |
| 0.7937500000000001 | 0 |
| 0.7944444444444444 | 0 |
| 0.7951388888888888 | 0 |
| 0.7958333333333334 | 0 |
| 0.7965277777777778 | 0 |
| 0.7972222222222222 | 0 |
| 0.7979166666666666 | 0 |
| 0.7986111111111112 | 0 |
| 0.7993055555555556 | 0 |
| 0.7999999999999999 | 0 |
| 0.8006944444444444 | 0 |
| 0.8013888888888889 | 0 |
| 0.8020833333333334 | 0 |
| 0.8027777777777777 | 0 |
| 0.8034722222222223 | 0 |
| 0.8041666666666667 | 0 |
| 0.8048611111111111 | 0 |
| 0.8055555555555555 | 0 |
| 0.80625 | 0 |
| 0.8069444444444445 | 0 |
| 0.8076388888888889 | 0 |
| 0.8083333333333332 | 0 |
| 0.8090277777777778 | 0 |
| 0.8097222222222222 | 0 |
| 0.8104166666666667 | 0 |
| 0.811111111111111 | 0 |
| 0.8118055555555556 | 0 |
| 0.8125 | 0 |
| 0.8131944444444444 | 0 |
| 0.813888888888889 | 0 |
| 0.8145833333333333 | 0 |
| 0.8152777777777778 | 0 |
| 0.8159722222222222 | 0 |
| 0.8166666666666668 | 0 |
| 0.8173611111111111 | 0 |
| 0.8180555555555555 | 0 |
| 0.81875 | 0 |
| 0.8194444444444445 | 0 |
| 0.8201388888888889 | 0 |
| 0.8208333333333333 | 0 |
| 0.8215277777777777 | 0 |
| 0.8222222222222223 | 0 |
| 0.8229166666666666 | 0 |
| 0.8236111111111111 | 0 |
| 0.8243055555555556 | 0 |
| 0.8250000000000001 | 0 |
| 0.8256944444444444 | 0 |
| 0.8263888888888888 | 0 |
| 0.8270833333333334 | 0 |
| 0.8277777777777778 | 0 |
| 0.8284722222222222 | 0 |
| 0.8291666666666666 | 0 |
| 0.8298611111111112 | 0 |
| 0.8305555555555556 | 0 |
| 0.8312499999999999 | 0 |
| 0.8319444444444444 | 0 |
| 0.8326388888888889 | 0 |
| 0.8333333333333334 | 0 |
| 0.8340277777777777 | 0 |
| 0.8347222222222223 | 0 |
| 0.8354166666666667 | 0 |
| 0.8361111111111111 | 0 |
| 0.8368055555555555 | 0 |
| 0.8375 | 0 |
| 0.8381944444444445 | 0 |
| 0.8388888888888889 | 0 |
| 0.8395833333333332 | 0 |
| 0.8402777777777778 | 0 |
| 0.8409722222222222 | 0 |
| 0.8416666666666667 | 0 |
| 0.842361111111111 | 0 |
| 0.8430555555555556 | 0 |
| 0.84375 | 0 |
| 0.8444444444444444 | 0 |
| 0.845138888888889 | 0 |
| 0.8458333333333333 | 0 |
| 0.8465277777777778 | 0 |
| 0.8472222222222222 | 0 |
| 0.8479166666666668 | 0 |
| 0.8486111111111111 | 0 |
| 0.8493055555555555 | 0 |
| 0.85 | 0 |
| 0.8506944444444445 | 0 |
| 0.8513888888888889 | 0 |
| 0.8520833333333333 | 0 |
| 0.8527777777777777 | 0 |
| 0.8534722222222223 | 0 |
| 0.8541666666666666 | 0 |
| 0.8548611111111111 | 0 |
| 0.8555555555555556 | 0 |
| 0.8562500000000001 | 0 |
| 0.8569444444444444 | 0 |
| 0.8576388888888888 | 0 |
| 0.8583333333333334 | 0 |
| 0.8590277777777778 | 0 |
| 0.8597222222222222 | 0 |
| 0.8604166666666666 | 0 |
| 0.8611111111111112 | 0 |
| 0.8618055555555556 | 0 |
| 0.8624999999999999 | 0 |
| 0.8631944444444444 | 0 |
| 0.8638888888888889 | 0 |
| 0.8645833333333334 | 0 |
| 0.8652777777777777 | 0 |
| 0.8659722222222223 | 0 |
| 0.8666666666666667 | 0 |
| 0.8673611111111111 | 0 |
| 0.8680555555555555 | 0 |
| 0.86875 | 0 |
| 0.8694444444444445 | 0 |
| 0.8701388888888889 | 0 |
| 0.8708333333333332 | 0 |
| 0.8715277777777778 | 0 |
| 0.8722222222222222 | 0 |
| 0.8729166666666667 | 0 |
| 0.873611111111111 | 0 |
| 0.8743055555555556 | 0 |
| 0.875 | 0 |
| 0.8756944444444444 | 0 |
| 0.876388888888889 | 0 |
| 0.8770833333333333 | 0 |
| 0.8777777777777778 | 0 |
| 0.8784722222222222 | 0 |
| 0.8791666666666668 | 0 |
| 0.8798611111111111 | 0 |
| 0.8805555555555555 | 0 |
| 0.88125 | 0 |
| 0.8819444444444445 | 0 |
| 0.8826388888888889 | 0 |
| 0.8833333333333333 | 0 |
| 0.8840277777777777 | 0 |
| 0.8847222222222223 | 0 |
| 0.8854166666666666 | 0 |
| 0.8861111111111111 | 0 |
| 0.8868055555555556 | 0 |
| 0.8875000000000001 | 0 |
| 0.8881944444444444 | 0 |
| 0.8888888888888888 | 0 |
| 0.8895833333333334 | 0 |
| 0.8902777777777778 | 0 |
| 0.8909722222222222 | 0 |
| 0.8916666666666666 | 0 |
| 0.8923611111111112 | 0 |
| 0.8930555555555556 | 0 |
| 0.8937499999999999 | 0 |
| 0.8944444444444444 | 0 |
| 0.8951388888888889 | 0 |
| 0.8958333333333334 | 0 |
| 0.8965277777777777 | 0 |
| 0.8972222222222223 | 0 |
| 0.8979166666666667 | 0 |
| 0.8986111111111111 | 0 |
| 0.8993055555555555 | 0 |
| 0.9 | 0 |
| 0.9006944444444445 | 0 |
| 0.9013888888888889 | 0 |
| 0.9020833333333332 | 0 |
| 0.9027777777777778 | 0 |
| 0.9034722222222222 | 0 |
| 0.9041666666666667 | 0 |
| 0.904861111111111 | 0 |
| 0.9055555555555556 | 0 |
| 0.90625 | 0 |
| 0.9069444444444444 | 0 |
| 0.907638888888889 | 0 |
| 0.9083333333333333 | 0 |
| 0.9090277777777778 | 0 |
| 0.9097222222222222 | 0 |
| 0.9104166666666668 | 0 |
| 0.9111111111111111 | 0 |
| 0.9118055555555555 | 0 |
| 0.9125 | 0 |
| 0.9131944444444445 | 0 |
| 0.9138888888888889 | 0 |
| 0.9145833333333333 | 0 |
| 0.9152777777777777 | 0 |
| 0.9159722222222223 | 0 |
| 0.9166666666666666 | 0 |
| 0.9173611111111111 | 0 |
| 0.9180555555555556 | 0 |
| 0.9187500000000001 | 0 |
| 0.9194444444444444 | 0 |
| 0.9201388888888888 | 0 |
| 0.9208333333333334 | 0 |
| 0.9215277777777778 | 0 |
| 0.9222222222222222 | 0 |
| 0.9229166666666666 | 0 |
| 0.9236111111111112 | 0 |
| 0.9243055555555556 | 0 |
| 0.9249999999999999 | 0 |
| 0.9256944444444444 | 0 |
| 0.9263888888888889 | 0 |
| 0.9270833333333334 | 0 |
| 0.9277777777777777 | 0 |
| 0.9284722222222223 | 0 |
| 0.9291666666666667 | 0 |
| 0.9298611111111111 | 0 |
| 0.9305555555555555 | 0 |
| 0.93125 | 0 |
| 0.9319444444444445 | 0 |
| 0.9326388888888889 | 0 |
| 0.9333333333333332 | 0 |
| 0.9340277777777778 | 0 |
| 0.9347222222222222 | 0 |
| 0.9354166666666667 | 0 |
| 0.936111111111111 | 0 |
| 0.9368055555555556 | 0 |
| 0.9375 | 0 |
| 0.9381944444444444 | 0 |
| 0.938888888888889 | 0 |
| 0.9395833333333333 | 0 |
| 0.9402777777777778 | 0 |
| 0.9409722222222222 | 0 |
| 0.9416666666666668 | 0 |
| 0.9423611111111111 | 0 |
| 0.9430555555555555 | 0 |
| 0.94375 | 0 |
| 0.9444444444444445 | 0 |
| 0.9451388888888889 | 0 |
| 0.9458333333333333 | 0 |
| 0.9465277777777777 | 0 |
| 0.9472222222222223 | 0 |
| 0.9479166666666666 | 0 |
| 0.9486111111111111 | 0 |
| 0.9493055555555556 | 0 |
| 0.9500000000000001 | 0 |
| 0.9506944444444444 | 0 |
| 0.9513888888888888 | 0 |
| 0.9520833333333334 | 0 |
| 0.9527777777777778 | 0 |
| 0.9534722222222222 | 0 |
| 0.9541666666666666 | 0 |
| 0.9548611111111112 | 0 |
| 0.9555555555555556 | 0 |
| 0.9562499999999999 | 0 |
| 0.9569444444444444 | 0 |
| 0.9576388888888889 | 0 |
| 0.9583333333333334 | 0 |
| 0.9590277777777777 | 0 |
| 0.9597222222222223 | 0 |
| 0.9604166666666667 | 0 |
| 0.9611111111111111 | 0 |
| 0.9618055555555555 | 0 |
| 0.9625 | 0 |
| 0.9631944444444445 | 0 |
| 0.9638888888888889 | 0 |
| 0.9645833333333332 | 0 |
| 0.9652777777777778 | 0 |
| 0.9659722222222222 | 0 |
| 0.9666666666666667 | 0 |
| 0.967361111111111 | 0 |
| 0.9680555555555556 | 0 |
| 0.96875 | 0 |
| 0.9694444444444444 | 0 |
| 0.970138888888889 | 0 |
| 0.9708333333333333 | 0 |
| 0.9715277777777778 | 0 |
| 0.9722222222222222 | 0 |
| 0.9729166666666668 | 0 |
| 0.9736111111111111 | 0 |
| 0.9743055555555555 | 0 |
| 0.975 | 0 |
| 0.9756944444444445 | 0 |
| 0.9763888888888889 | 0 |
| 0.9770833333333333 | 0 |
| 0.9777777777777777 | 0 |
| 0.9784722222222223 | 0 |
| 0.9791666666666666 | 0 |
| 0.9798611111111111 | 0 |
| 0.9805555555555556 | 0 |
| 0.9812500000000001 | 0 |
| 0.9819444444444444 | 0 |
| 0.9826388888888888 | 0 |
| 0.9833333333333334 | 0 |
| 0.9840277777777778 | 0 |
| 0.9847222222222222 | 0 |
| 0.9854166666666666 | 0 |
| 0.9861111111111112 | 0 |
| 0.9868055555555556 | 0 |
| 0.9874999999999999 | 0 |
| 0.9881944444444444 | 0 |
| 0.9888888888888889 | 0 |
| 0.9895833333333334 | 0 |
| 0.9902777777777777 | 0 |
| 0.9909722222222223 | 0 |
| 0.9916666666666667 | 0 |
| 0.9923611111111111 | 0 |
| 0.9930555555555555 | 0 |
| 0.99375 | 0 |
| 0.9944444444444445 | 0 |
| 0.9951388888888889 | 0 |
| 0.9958333333333332 | 0 |
| 0.9965277777777778 | 0 |
| 0.9972222222222222 | 0 |
| 0.9979166666666667 | 0 |
| 0.998611111111111 | 0 |
| 0.9993055555555556 | 0 |